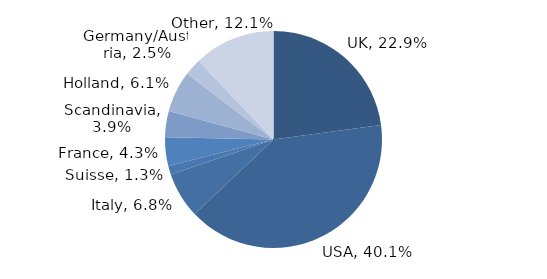
| Category | Investment Style |
|---|---|
| UK | 0.229 |
| USA | 0.401 |
| Italy | 0.068 |
| Suisse | 0.013 |
| France | 0.043 |
| Scandinavia | 0.039 |
| Holland | 0.061 |
| Germany/Austria | 0.025 |
| Other | 0.121 |